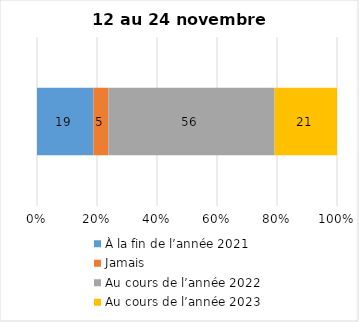
| Category | À la fin de l’année 2021 | Jamais | Au cours de l’année 2022 | Au cours de l’année 2023 |
|---|---|---|---|---|
| 0 | 19 | 5 | 56 | 21 |